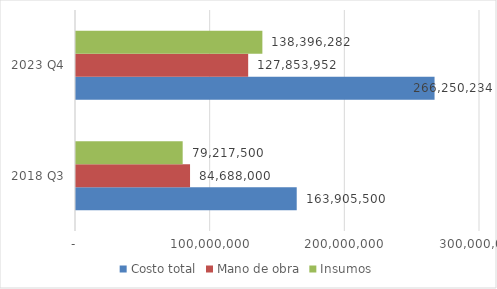
| Category | Costo total | Mano de obra | Insumos |
|---|---|---|---|
| 2018 Q3 | 163905500 | 84688000 | 79217500 |
| 2023 Q4 | 266250234.229 | 127853952 | 138396282.229 |